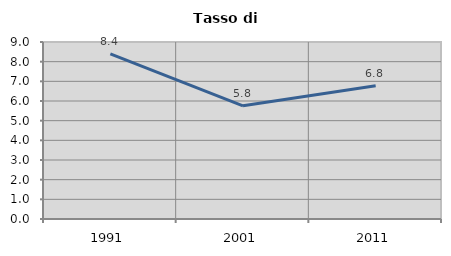
| Category | Tasso di disoccupazione   |
|---|---|
| 1991.0 | 8.392 |
| 2001.0 | 5.753 |
| 2011.0 | 6.775 |